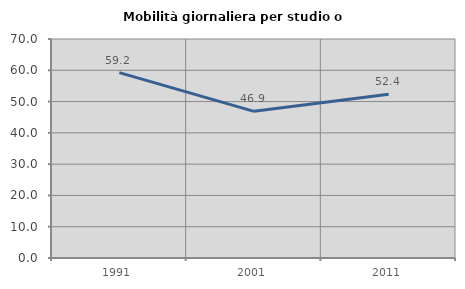
| Category | Mobilità giornaliera per studio o lavoro |
|---|---|
| 1991.0 | 59.239 |
| 2001.0 | 46.872 |
| 2011.0 | 52.369 |